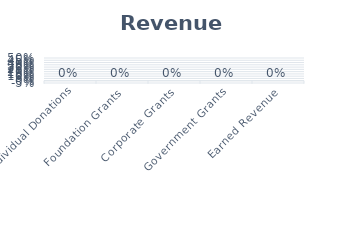
| Category | Grants |
|---|---|
| Individual Donations | 0 |
| Foundation Grants | 0 |
| Corporate Grants | 0 |
| Government Grants | 0 |
| Earned Revenue | 0 |